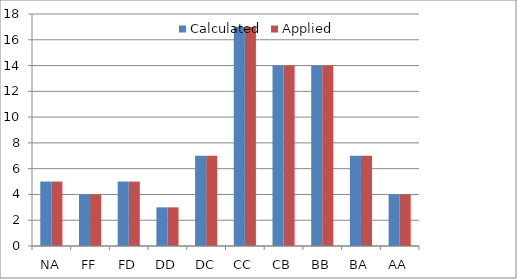
| Category | Calculated | Applied |
|---|---|---|
| NA | 5 | 5 |
| FF | 4 | 4 |
| FD | 5 | 5 |
| DD | 3 | 3 |
| DC | 7 | 7 |
| CC | 17 | 17 |
| CB | 14 | 14 |
| BB | 14 | 14 |
| BA | 7 | 7 |
| AA | 4 | 4 |